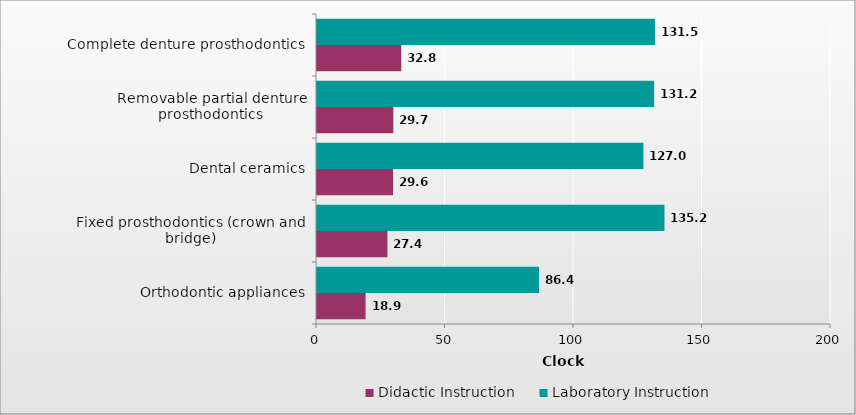
| Category | Didactic Instruction | Laboratory Instruction |
|---|---|---|
| Orthodontic appliances | 18.9 | 86.4 |
| Fixed prosthodontics (crown and bridge) | 27.4 | 135.2 |
| Dental ceramics | 29.6 | 127 |
| Removable partial denture prosthodontics | 29.7 | 131.2 |
| Complete denture prosthodontics | 32.8 | 131.5 |